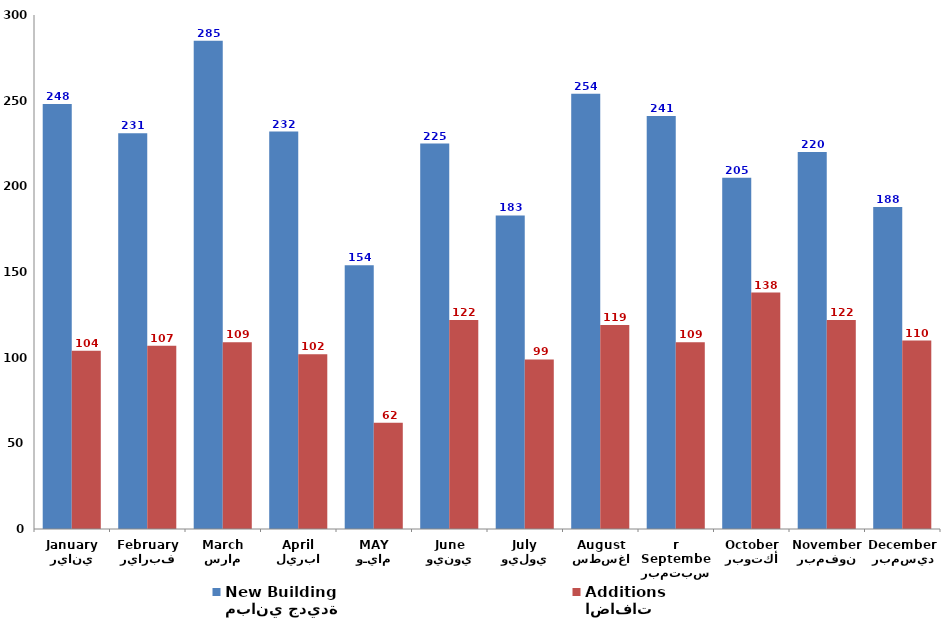
| Category | مباني جديدة
New Building | اضافات
Additions |
|---|---|---|
| يناير
January | 248 | 104 |
| فبراير
February | 231 | 107 |
| مارس
March | 285 | 109 |
| ابريل
April | 232 | 102 |
| مايـو
MAY | 154 | 62 |
| يونيو
June | 225 | 122 |
| يوليو
July | 183 | 99 |
| اغسطس
August | 254 | 119 |
| سبتمبر
September | 241 | 109 |
| أكتوبر
October | 205 | 138 |
| نوفمبر
November | 220 | 122 |
| ديسمبر
December | 188 | 110 |